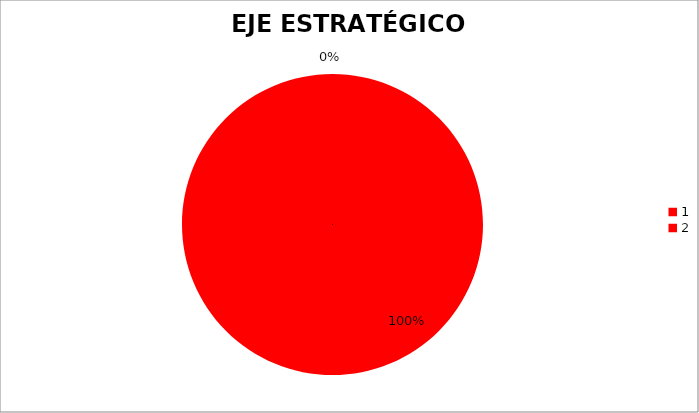
| Category | Series 0 |
|---|---|
| 0 | 17 |
| 1 | 0 |